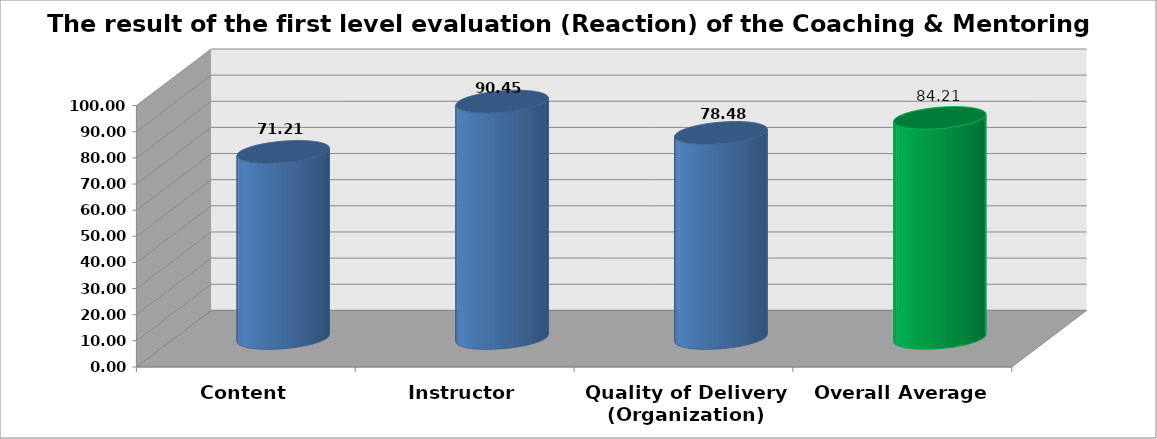
| Category | Rating Score |
|---|---|
| Content | 71.212 |
| Instructor | 90.455 |
| Quality of Delivery (Organization) | 78.485 |
| Overall Average | 84.212 |